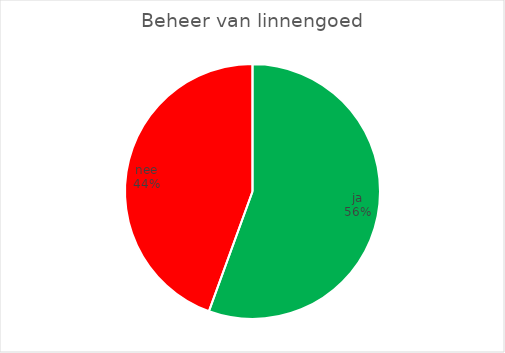
| Category | Beheer van linnengoed |
|---|---|
| ja | 5 |
| nee | 4 |